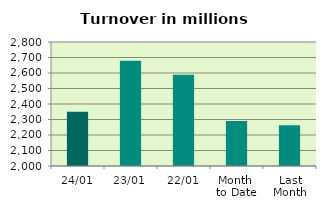
| Category | Series 0 |
|---|---|
| 24/01 | 2350.554 |
| 23/01 | 2678.64 |
| 22/01 | 2588.399 |
| Month 
to Date | 2289.581 |
| Last
Month | 2262.611 |